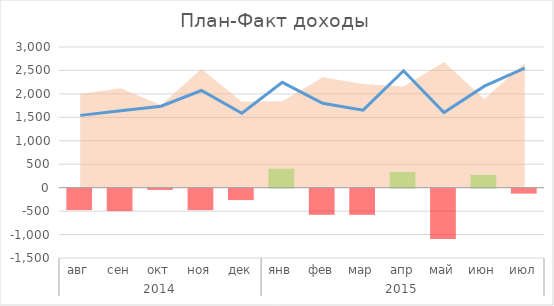
| Category | откл |
|---|---|
| 0 | -456.918 |
| 1 | -478.197 |
| 2 | -26.859 |
| 3 | -457.775 |
| 4 | -243.69 |
| 5 | 404.723 |
| 6 | -557.843 |
| 7 | -558.075 |
| 8 | 334.461 |
| 9 | -1075.757 |
| 10 | 272.598 |
| 11 | -106.071 |